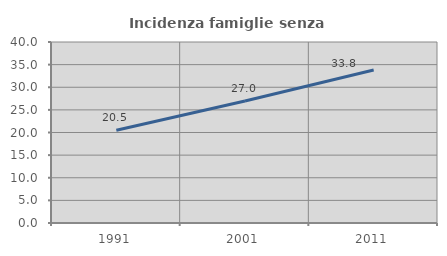
| Category | Incidenza famiglie senza nuclei |
|---|---|
| 1991.0 | 20.493 |
| 2001.0 | 26.975 |
| 2011.0 | 33.795 |